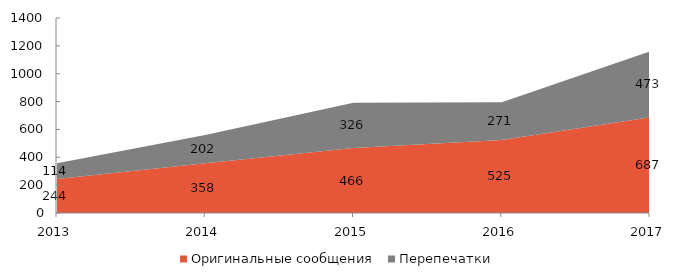
| Category | Оригинальные сообщения | Перепечатки |
|---|---|---|
| 2013 | 244 | 114 |
| 2014 | 358 | 202 |
| 2015 | 466 | 326 |
| 2016 | 525 | 271 |
| 2017 | 687 | 473 |